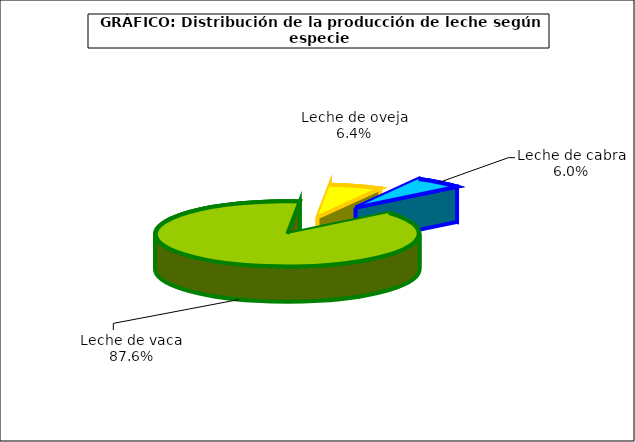
| Category | Series 0 |
|---|---|
| Leche de vaca | 7384.533 |
| Leche de oveja | 535.884 |
| Leche de cabra | 508.148 |